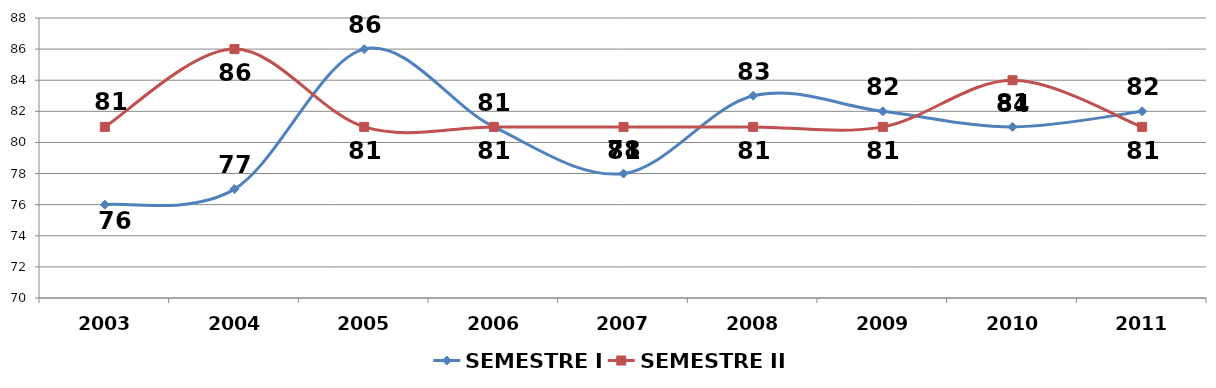
| Category | SEMESTRE I | SEMESTRE II |
|---|---|---|
| 2003.0 | 76 | 81 |
| 2004.0 | 77 | 86 |
| 2005.0 | 86 | 81 |
| 2006.0 | 81 | 81 |
| 2007.0 | 78 | 81 |
| 2008.0 | 83 | 81 |
| 2009.0 | 82 | 81 |
| 2010.0 | 81 | 84 |
| 2011.0 | 82 | 81 |